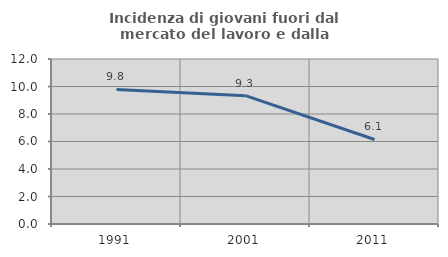
| Category | Incidenza di giovani fuori dal mercato del lavoro e dalla formazione  |
|---|---|
| 1991.0 | 9.788 |
| 2001.0 | 9.333 |
| 2011.0 | 6.147 |